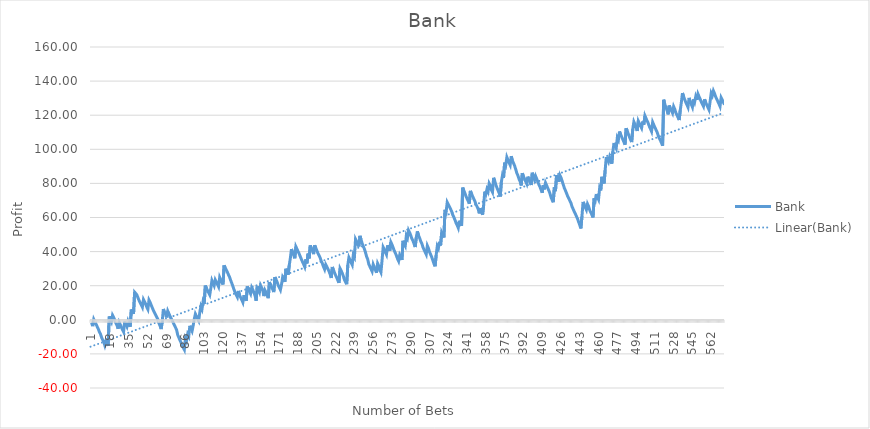
| Category | Bank |
|---|---|
| 1.0 | -1.77 |
| 2.0 | -3.72 |
| 3.0 | 0.27 |
| 4.0 | -1.12 |
| 5.0 | -2.42 |
| 6.0 | -3.89 |
| 7.0 | -5.2 |
| 8.0 | -6.92 |
| 9.0 | -8.2 |
| 10.0 | -10.2 |
| 11.0 | -11.67 |
| 12.0 | -12.96 |
| 13.0 | -15.01 |
| 14.0 | -12.37 |
| 15.0 | -13.69 |
| 16.0 | -15.27 |
| 17.0 | 1.97 |
| 18.0 | 0.54 |
| 19.0 | -1.01 |
| 20.0 | 2.66 |
| 21.0 | 1.39 |
| 22.0 | -0.14 |
| 23.0 | -1.87 |
| 24.0 | -3.16 |
| 25.0 | -5.25 |
| 26.0 | -1.48 |
| 27.0 | -2.83 |
| 28.0 | -4.46 |
| 29.0 | -5.82 |
| 30.0 | -7.08 |
| 31.0 | -1.03 |
| 32.0 | -2.74 |
| 33.0 | -4.05 |
| 34.0 | -0.89 |
| 35.0 | -2.67 |
| 36.0 | -4.04 |
| 37.0 | 6.04 |
| 38.0 | 4.67 |
| 39.0 | 3.37 |
| 40.0 | 16.2 |
| 41.0 | 15.47 |
| 42.0 | 14.65 |
| 43.0 | 12.97 |
| 44.0 | 11.39 |
| 45.0 | 10.05 |
| 46.0 | 8.74 |
| 47.0 | 7.4 |
| 48.0 | 11.93 |
| 49.0 | 10.66 |
| 50.0 | 9.36 |
| 51.0 | 7.46 |
| 52.0 | 6.16 |
| 53.0 | 11.57 |
| 54.0 | 10.32 |
| 55.0 | 8.6 |
| 56.0 | 7.05 |
| 57.0 | 5.49 |
| 58.0 | 4.21 |
| 59.0 | 2.88 |
| 60.0 | 1.63 |
| 61.0 | 0.25 |
| 62.0 | -2.01 |
| 63.0 | -3.52 |
| 64.0 | -5.45 |
| 65.0 | -0.96 |
| 66.0 | 6.31 |
| 67.0 | 4.49 |
| 68.0 | 3.24 |
| 69.0 | 1.38 |
| 70.0 | 5.15 |
| 71.0 | 3.67 |
| 72.0 | 2.24 |
| 73.0 | 0.94 |
| 74.0 | -0.51 |
| 75.0 | -1.76 |
| 76.0 | -3.15 |
| 77.0 | -4.5 |
| 78.0 | -5.85 |
| 79.0 | -8.86 |
| 80.0 | -10.36 |
| 81.0 | -11.91 |
| 82.0 | -13.35 |
| 83.0 | -15.01 |
| 84.0 | -16.27 |
| 85.0 | -17.53 |
| 86.0 | -10.86 |
| 87.0 | -12.28 |
| 88.0 | -8.51 |
| 89.0 | -9.77 |
| 90.0 | -3.52 |
| 91.0 | -5.11 |
| 92.0 | -6.61 |
| 93.0 | -3.39 |
| 94.0 | 0.39 |
| 95.0 | 3.43 |
| 96.0 | 2.05 |
| 97.0 | 0.76 |
| 98.0 | -0.55 |
| 99.0 | 4.45 |
| 100.0 | 7.89 |
| 101.0 | 6.29 |
| 102.0 | 10.77 |
| 103.0 | 9.27 |
| 104.0 | 20.07 |
| 105.0 | 18.67 |
| 106.0 | 17.17 |
| 107.0 | 15.87 |
| 108.0 | 14.57 |
| 109.0 | 18.57 |
| 110.0 | 23.07 |
| 111.0 | 21.57 |
| 112.0 | 20.07 |
| 113.0 | 23.43 |
| 114.0 | 22.13 |
| 115.0 | 20.83 |
| 116.0 | 19.43 |
| 117.0 | 24.89 |
| 118.0 | 23.39 |
| 119.0 | 22.09 |
| 120.0 | 20.69 |
| 121.0 | 31.89 |
| 122.0 | 30.49 |
| 123.0 | 29.19 |
| 124.0 | 27.89 |
| 125.0 | 26.39 |
| 126.0 | 24.99 |
| 127.0 | 23.09 |
| 128.0 | 21.39 |
| 129.0 | 19.59 |
| 130.0 | 17.69 |
| 131.0 | 16.09 |
| 132.0 | 14.59 |
| 133.0 | 13.29 |
| 134.0 | 16.93 |
| 135.0 | 14.43 |
| 136.0 | 13.03 |
| 137.0 | 11.73 |
| 138.0 | 10.23 |
| 139.0 | 14.43 |
| 140.0 | 12.53 |
| 141.0 | 11.13 |
| 142.0 | 19.58 |
| 143.0 | 17.98 |
| 144.0 | 16.58 |
| 145.0 | 15.28 |
| 146.0 | 18.96 |
| 147.0 | 17.66 |
| 148.0 | 15.96 |
| 149.0 | 14.26 |
| 150.0 | 11.16 |
| 151.0 | 19.56 |
| 152.0 | 17.46 |
| 153.0 | 16.06 |
| 154.0 | 20.2 |
| 155.0 | 18.8 |
| 156.0 | 17.5 |
| 157.0 | 13.9 |
| 158.0 | 17.3 |
| 159.0 | 16 |
| 160.0 | 14.4 |
| 161.0 | 12.7 |
| 162.0 | 22.05 |
| 163.0 | 20.65 |
| 164.0 | 19.15 |
| 165.0 | 17.85 |
| 166.0 | 16.25 |
| 167.0 | 25.05 |
| 168.0 | 23.65 |
| 169.0 | 22.15 |
| 170.0 | 20.25 |
| 171.0 | 18.95 |
| 172.0 | 17.55 |
| 173.0 | 20.79 |
| 174.0 | 24.95 |
| 175.0 | 23.65 |
| 176.0 | 22.25 |
| 177.0 | 29.95 |
| 178.0 | 28.15 |
| 179.0 | 26.45 |
| 180.0 | 32.05 |
| 181.0 | 36.25 |
| 182.0 | 41.47 |
| 183.0 | 39.67 |
| 184.0 | 37.87 |
| 185.0 | 36.07 |
| 186.0 | 42.87 |
| 187.0 | 41.47 |
| 188.0 | 40.07 |
| 189.0 | 38.67 |
| 190.0 | 37.07 |
| 191.0 | 35.47 |
| 192.0 | 33.97 |
| 193.0 | 32.57 |
| 194.0 | 31.07 |
| 195.0 | 35.49 |
| 196.0 | 33.09 |
| 197.0 | 38.81 |
| 198.0 | 36.01 |
| 199.0 | 43.61 |
| 200.0 | 41.91 |
| 201.0 | 40.71 |
| 202.0 | 38.51 |
| 203.0 | 43.71 |
| 204.0 | 42.11 |
| 205.0 | 40.61 |
| 206.0 | 38.91 |
| 207.0 | 37.71 |
| 208.0 | 36.31 |
| 209.0 | 34.31 |
| 210.0 | 33.01 |
| 211.0 | 31.11 |
| 212.0 | 29.61 |
| 213.0 | 32.41 |
| 214.0 | 31.21 |
| 215.0 | 29.81 |
| 216.0 | 28.41 |
| 217.0 | 26.71 |
| 218.0 | 24.51 |
| 219.0 | 30.97 |
| 220.0 | 29.27 |
| 221.0 | 27.57 |
| 222.0 | 26.07 |
| 223.0 | 24.67 |
| 224.0 | 23.07 |
| 225.0 | 21.67 |
| 226.0 | 30.07 |
| 227.0 | 28.77 |
| 228.0 | 27.37 |
| 229.0 | 25.47 |
| 230.0 | 23.47 |
| 231.0 | 22.17 |
| 232.0 | 20.87 |
| 233.0 | 32.12 |
| 234.0 | 36.54 |
| 235.0 | 35.14 |
| 236.0 | 33.64 |
| 237.0 | 32.24 |
| 238.0 | 38.09 |
| 239.0 | 36.79 |
| 240.0 | 47.29 |
| 241.0 | 45.99 |
| 242.0 | 44.59 |
| 243.0 | 42.99 |
| 244.0 | 49.23 |
| 245.0 | 47.03 |
| 246.0 | 44.83 |
| 247.0 | 43.13 |
| 248.0 | 41.63 |
| 249.0 | 39.53 |
| 250.0 | 37.13 |
| 251.0 | 35.53 |
| 252.0 | 32.63 |
| 253.0 | 31.23 |
| 254.0 | 29.83 |
| 255.0 | 28.43 |
| 256.0 | 32.51 |
| 257.0 | 30.91 |
| 258.0 | 29.21 |
| 259.0 | 27.61 |
| 260.0 | 33.05 |
| 261.0 | 31.65 |
| 262.0 | 29.25 |
| 263.0 | 27.85 |
| 264.0 | 34.85 |
| 265.0 | 42.55 |
| 266.0 | 41.25 |
| 267.0 | 39.65 |
| 268.0 | 38.25 |
| 269.0 | 43.69 |
| 270.0 | 42.09 |
| 271.0 | 40.39 |
| 272.0 | 45.51 |
| 273.0 | 44.11 |
| 274.0 | 42.41 |
| 275.0 | 40.61 |
| 276.0 | 39.21 |
| 277.0 | 37.71 |
| 278.0 | 35.81 |
| 279.0 | 34.41 |
| 280.0 | 38.01 |
| 281.0 | 36.71 |
| 282.0 | 35.11 |
| 283.0 | 46.31 |
| 284.0 | 44.61 |
| 285.0 | 43.31 |
| 286.0 | 49.39 |
| 287.0 | 47.99 |
| 288.0 | 52.47 |
| 289.0 | 51.17 |
| 290.0 | 49.47 |
| 291.0 | 47.57 |
| 292.0 | 46.27 |
| 293.0 | 44.57 |
| 294.0 | 42.67 |
| 295.0 | 48.39 |
| 296.0 | 51.87 |
| 297.0 | 49.57 |
| 298.0 | 47.97 |
| 299.0 | 46.07 |
| 300.0 | 44.77 |
| 301.0 | 42.67 |
| 302.0 | 41.07 |
| 303.0 | 39.77 |
| 304.0 | 38.37 |
| 305.0 | 43.47 |
| 306.0 | 41.97 |
| 307.0 | 39.77 |
| 308.0 | 38.27 |
| 309.0 | 36.77 |
| 310.0 | 34.87 |
| 311.0 | 32.87 |
| 312.0 | 31.37 |
| 313.0 | 37.87 |
| 314.0 | 43.19 |
| 315.0 | 41.89 |
| 316.0 | 45.79 |
| 317.0 | 43.59 |
| 318.0 | 51.29 |
| 319.0 | 49.99 |
| 320.0 | 48.29 |
| 321.0 | 64.49 |
| 322.0 | 63.19 |
| 323.0 | 68.91 |
| 324.0 | 67.61 |
| 325.0 | 66.31 |
| 326.0 | 65.01 |
| 327.0 | 63.61 |
| 328.0 | 61.51 |
| 329.0 | 60.21 |
| 330.0 | 58.61 |
| 331.0 | 56.81 |
| 332.0 | 55.51 |
| 333.0 | 53.91 |
| 334.0 | 58.11 |
| 335.0 | 56.41 |
| 336.0 | 55.11 |
| 337.0 | 77.51 |
| 338.0 | 75.91 |
| 339.0 | 74.31 |
| 340.0 | 72.41 |
| 341.0 | 71.01 |
| 342.0 | 69.71 |
| 343.0 | 68.11 |
| 344.0 | 75.61 |
| 345.0 | 74.01 |
| 346.0 | 72.41 |
| 347.0 | 71.01 |
| 348.0 | 69.71 |
| 349.0 | 67.71 |
| 350.0 | 66.41 |
| 351.0 | 65.01 |
| 352.0 | 62.41 |
| 353.0 | 65.54 |
| 354.0 | 63.24 |
| 355.0 | 61.64 |
| 356.0 | 67.24 |
| 357.0 | 75.24 |
| 358.0 | 73.74 |
| 359.0 | 76.62 |
| 360.0 | 75.22 |
| 361.0 | 79.98 |
| 362.0 | 78.68 |
| 363.0 | 76.18 |
| 364.0 | 74.88 |
| 365.0 | 83.28 |
| 366.0 | 81.58 |
| 367.0 | 79.18 |
| 368.0 | 77.48 |
| 369.0 | 75.88 |
| 370.0 | 74.38 |
| 371.0 | 72.28 |
| 372.0 | 80.68 |
| 373.0 | 84.68 |
| 374.0 | 83.18 |
| 375.0 | 92.18 |
| 376.0 | 90.78 |
| 377.0 | 95.37 |
| 378.0 | 93.77 |
| 379.0 | 92.17 |
| 380.0 | 90.77 |
| 381.0 | 95.97 |
| 382.0 | 93.37 |
| 383.0 | 91.97 |
| 384.0 | 90.37 |
| 385.0 | 88.37 |
| 386.0 | 86.07 |
| 387.0 | 84.67 |
| 388.0 | 82.57 |
| 389.0 | 81.17 |
| 390.0 | 78.77 |
| 391.0 | 85.97 |
| 392.0 | 84.17 |
| 393.0 | 82.67 |
| 394.0 | 81.17 |
| 395.0 | 79.77 |
| 396.0 | 83.95 |
| 397.0 | 82.25 |
| 398.0 | 80.65 |
| 399.0 | 79.05 |
| 400.0 | 86.25 |
| 401.0 | 84.15 |
| 402.0 | 82.15 |
| 403.0 | 84.32 |
| 404.0 | 82.72 |
| 405.0 | 81.02 |
| 406.0 | 79.32 |
| 407.0 | 77.92 |
| 408.0 | 76.22 |
| 409.0 | 74.52 |
| 410.0 | 78.94 |
| 411.0 | 76.54 |
| 412.0 | 80.34 |
| 413.0 | 78.84 |
| 414.0 | 77.24 |
| 415.0 | 75.84 |
| 416.0 | 74.14 |
| 417.0 | 71.84 |
| 418.0 | 70.34 |
| 419.0 | 68.94 |
| 420.0 | 77.68 |
| 421.0 | 75.38 |
| 422.0 | 84.88 |
| 423.0 | 82.78 |
| 424.0 | 80.88 |
| 425.0 | 84.78 |
| 426.0 | 83.38 |
| 427.0 | 81.48 |
| 428.0 | 79.38 |
| 429.0 | 77.38 |
| 430.0 | 75.88 |
| 431.0 | 74.28 |
| 432.0 | 72.58 |
| 433.0 | 71.28 |
| 434.0 | 69.88 |
| 435.0 | 68.58 |
| 436.0 | 66.38 |
| 437.0 | 64.98 |
| 438.0 | 63.48 |
| 439.0 | 62.18 |
| 440.0 | 60.68 |
| 441.0 | 59.28 |
| 442.0 | 57.38 |
| 443.0 | 55.48 |
| 444.0 | 53.58 |
| 445.0 | 60.73 |
| 446.0 | 69.13 |
| 447.0 | 67.73 |
| 448.0 | 65.93 |
| 449.0 | 64.53 |
| 450.0 | 67.95 |
| 451.0 | 66.55 |
| 452.0 | 64.35 |
| 453.0 | 62.95 |
| 454.0 | 61.55 |
| 455.0 | 60.05 |
| 456.0 | 71.24 |
| 457.0 | 69.94 |
| 458.0 | 73.76 |
| 459.0 | 71.96 |
| 460.0 | 70.56 |
| 461.0 | 77.23 |
| 462.0 | 75.83 |
| 463.0 | 83.83 |
| 464.0 | 82.33 |
| 465.0 | 79.93 |
| 466.0 | 87.76 |
| 467.0 | 95.41 |
| 468.0 | 94.01 |
| 469.0 | 92.61 |
| 470.0 | 95.37 |
| 471.0 | 93.27 |
| 472.0 | 91.57 |
| 473.0 | 98.77 |
| 474.0 | 103.7 |
| 475.0 | 101.9 |
| 476.0 | 100.5 |
| 477.0 | 106.8 |
| 478.0 | 105.5 |
| 479.0 | 110.44 |
| 480.0 | 108.74 |
| 481.0 | 107.24 |
| 482.0 | 105.74 |
| 483.0 | 104.24 |
| 484.0 | 102.74 |
| 485.0 | 112.34 |
| 486.0 | 110.84 |
| 487.0 | 108.94 |
| 488.0 | 107.24 |
| 489.0 | 105.64 |
| 490.0 | 104.24 |
| 491.0 | 111.89 |
| 492.0 | 116.14 |
| 493.0 | 114.64 |
| 494.0 | 112.64 |
| 495.0 | 110.74 |
| 496.0 | 116.59 |
| 497.0 | 115.19 |
| 498.0 | 113.79 |
| 499.0 | 112.49 |
| 500.0 | 116.33 |
| 501.0 | 114.43 |
| 502.0 | 119.68 |
| 503.0 | 118.18 |
| 504.0 | 116.68 |
| 505.0 | 115.28 |
| 506.0 | 113.38 |
| 507.0 | 111.98 |
| 508.0 | 110.48 |
| 509.0 | 115.88 |
| 510.0 | 114.38 |
| 511.0 | 112.88 |
| 512.0 | 111.48 |
| 513.0 | 110.08 |
| 514.0 | 108.08 |
| 515.0 | 106.48 |
| 516.0 | 105.18 |
| 517.0 | 103.78 |
| 518.0 | 102.08 |
| 519.0 | 129.08 |
| 520.0 | 126.28 |
| 521.0 | 124.78 |
| 522.0 | 122.88 |
| 523.0 | 120.48 |
| 524.0 | 125.68 |
| 525.0 | 124.08 |
| 526.0 | 122.68 |
| 527.0 | 121.28 |
| 528.0 | 125.06 |
| 529.0 | 123.56 |
| 530.0 | 121.46 |
| 531.0 | 120.16 |
| 532.0 | 118.66 |
| 533.0 | 117.16 |
| 534.0 | 122.94 |
| 535.0 | 127.58 |
| 536.0 | 132.98 |
| 537.0 | 131.08 |
| 538.0 | 129.18 |
| 539.0 | 127.58 |
| 540.0 | 126.18 |
| 541.0 | 124.68 |
| 542.0 | 130.14 |
| 543.0 | 127.84 |
| 544.0 | 126.34 |
| 545.0 | 124.74 |
| 546.0 | 129.34 |
| 547.0 | 127.64 |
| 548.0 | 130.88 |
| 549.0 | 128.98 |
| 550.0 | 132.48 |
| 551.0 | 130.88 |
| 552.0 | 129.48 |
| 553.0 | 127.88 |
| 554.0 | 126.48 |
| 555.0 | 125.18 |
| 556.0 | 129.32 |
| 557.0 | 127.62 |
| 558.0 | 126.02 |
| 559.0 | 124.62 |
| 560.0 | 123.22 |
| 561.0 | 128.02 |
| 562.0 | 132.92 |
| 563.0 | 131.52 |
| 564.0 | 134.28 |
| 565.0 | 132.78 |
| 566.0 | 130.88 |
| 567.0 | 129.48 |
| 568.0 | 128.08 |
| 569.0 | 126.68 |
| 570.0 | 125.18 |
| 571.0 | 130.28 |
| 572.0 | 128.98 |
| 573.0 | 127.58 |
| 574.0 | 126.18 |